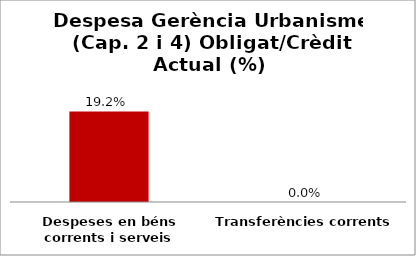
| Category | Series 0 |
|---|---|
| Despeses en béns corrents i serveis | 0.192 |
| Transferències corrents | 0 |